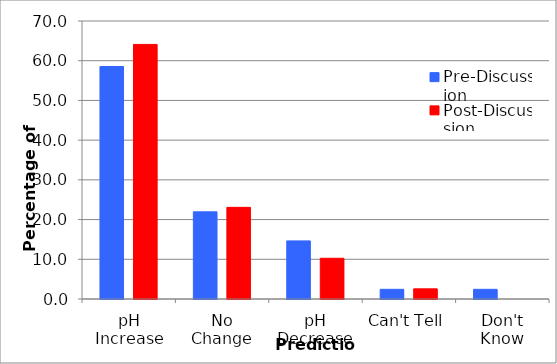
| Category | Pre-Discussion | Post-Discussion |
|---|---|---|
| pH Increase | 58.537 | 64.103 |
| No Change | 21.951 | 23.077 |
| pH Decrease | 14.634 | 10.256 |
| Can't Tell | 2.439 | 2.564 |
| Don't Know | 2.439 | 0 |